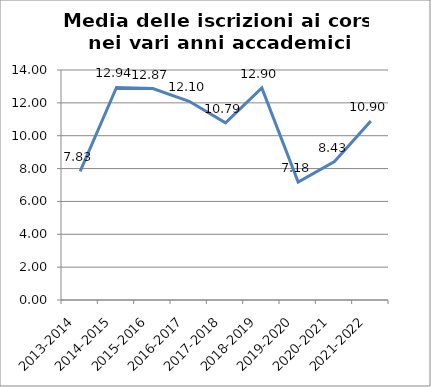
| Category | Media delle iscrizioni ai Corsi |
|---|---|
| 2013-2014 | 7.833 |
| 2014-2015 | 12.935 |
| 2015-2016 | 12.87 |
| 2016-2017 | 12.098 |
| 2017-2018 | 10.787 |
| 2018-2019 | 12.905 |
| 2019-2020 | 7.175 |
| 2020-2021 | 8.426 |
| 2021-2022 | 10.903 |